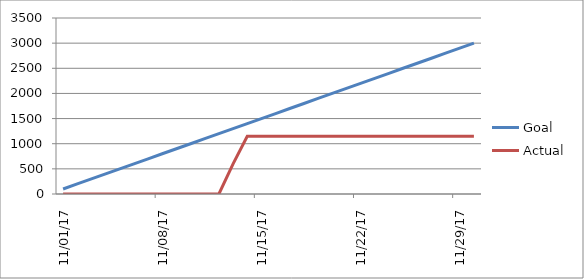
| Category | Goal | Actual |
|---|---|---|
| 2017-11-01 | 100 | 0 |
| 2017-11-02 | 200 | 0 |
| 2017-11-03 | 300 | 0 |
| 2017-11-04 | 400 | 0 |
| 2017-11-05 | 500 | 0 |
| 2017-11-06 | 600 | 0 |
| 2017-11-07 | 700 | 0 |
| 2017-11-08 | 800 | 0 |
| 2017-11-09 | 900 | 0 |
| 2017-11-10 | 1000 | 0 |
| 2017-11-11 | 1100 | 0 |
| 2017-11-12 | 1200 | 0 |
| 2017-11-13 | 1300 | 599 |
| 2017-11-14 | 1400 | 1148 |
| 2017-11-15 | 1500 | 1148 |
| 2017-11-16 | 1600 | 1148 |
| 2017-11-17 | 1700 | 1148 |
| 2017-11-18 | 1800 | 1148 |
| 2017-11-19 | 1900 | 1148 |
| 2017-11-20 | 2000 | 1148 |
| 2017-11-21 | 2100 | 1148 |
| 2017-11-22 | 2200 | 1148 |
| 2017-11-23 | 2300 | 1148 |
| 2017-11-24 | 2400 | 1148 |
| 2017-11-25 | 2500 | 1148 |
| 2017-11-26 | 2600 | 1148 |
| 2017-11-27 | 2700 | 1148 |
| 2017-11-28 | 2800 | 1148 |
| 2017-11-29 | 2900 | 1148 |
| 2017-11-30 | 3000 | 1148 |